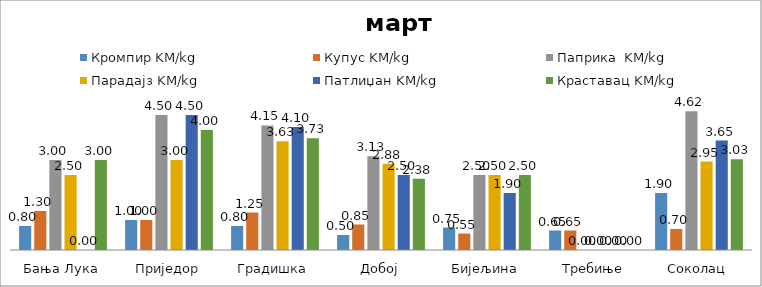
| Category | Кромпир KM/kg | Купус KM/kg | Паприка  KM/kg | Парадајз KM/kg | Патлиџан KM/kg | Краставац KM/kg |
|---|---|---|---|---|---|---|
| Бања Лука | 0.8 | 1.3 | 3 | 2.5 | 0 | 3 |
| Приједор | 1 | 1 | 4.5 | 3 | 4.5 | 4 |
| Градишка | 0.8 | 1.25 | 4.15 | 3.625 | 4.1 | 3.725 |
| Добој | 0.5 | 0.85 | 3.125 | 2.875 | 2.5 | 2.375 |
| Бијељина | 0.75 | 0.55 | 2.5 | 2.5 | 1.9 | 2.5 |
|  Требиње | 0.65 | 0.65 | 0 | 0 | 0 | 0 |
| Соколац | 1.9 | 0.7 | 4.623 | 2.948 | 3.65 | 3.025 |